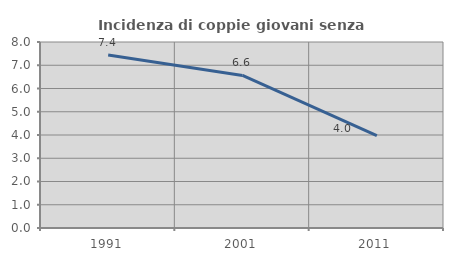
| Category | Incidenza di coppie giovani senza figli |
|---|---|
| 1991.0 | 7.44 |
| 2001.0 | 6.56 |
| 2011.0 | 3.974 |